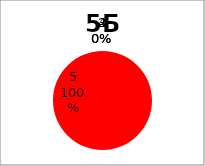
| Category | Series 0 |
|---|---|
| 5.0 | 13 |
| 4.0 | 0 |
| 3.0 | 0 |
| 2.0 | 0 |